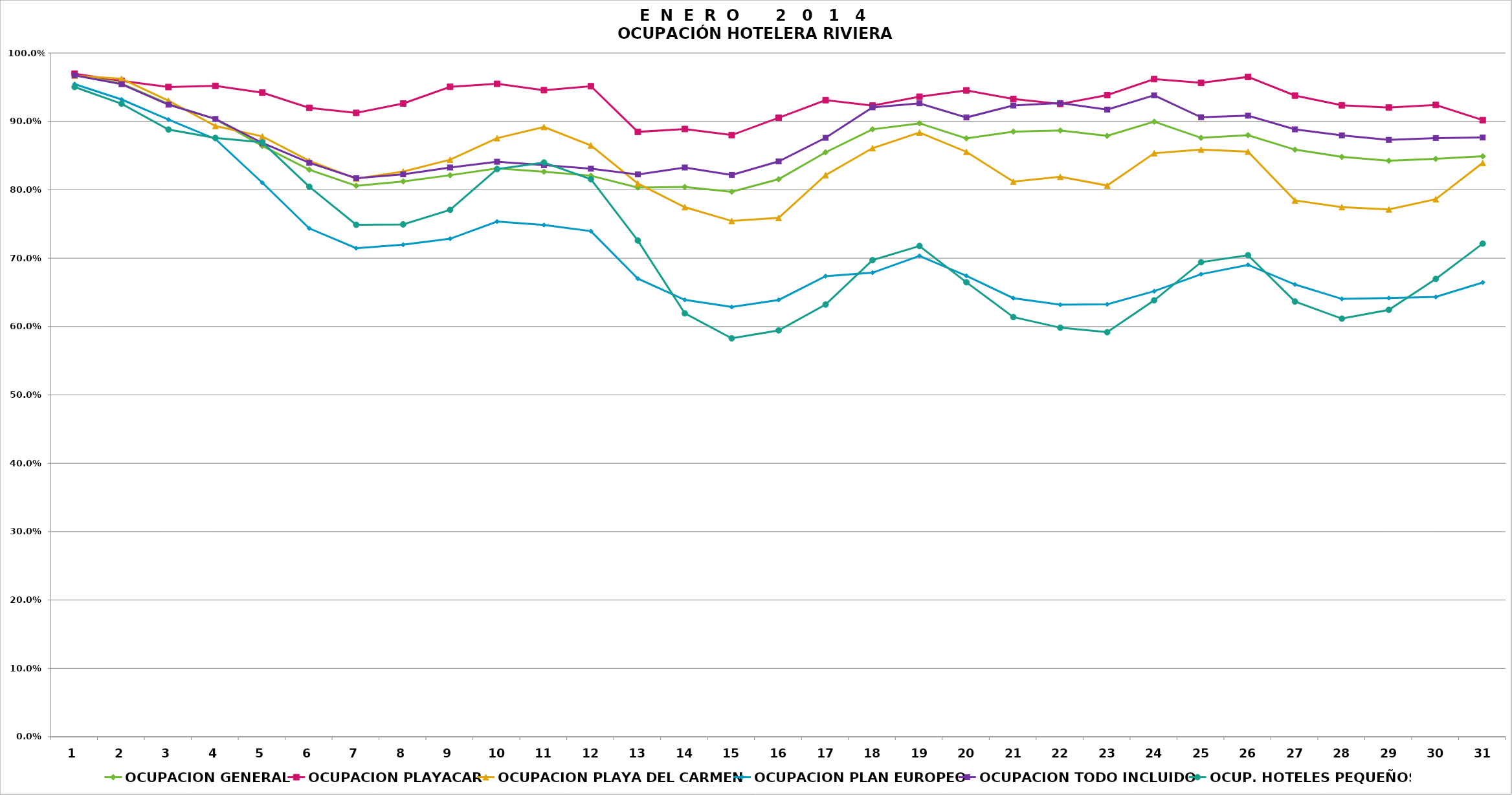
| Category | OCUPACION GENERAL | OCUPACION PLAYACAR | OCUPACION PLAYA DEL CARMEN | OCUPACION PLAN EUROPEO | OCUPACION TODO INCLUIDO | OCUP. HOTELES PEQUEÑOS |
|---|---|---|---|---|---|---|
| 1.0 | 0.97 | 0.97 | 0.967 | 0.955 | 0.967 | 0.95 |
| 2.0 | 0.955 | 0.959 | 0.962 | 0.932 | 0.954 | 0.926 |
| 3.0 | 0.926 | 0.95 | 0.93 | 0.903 | 0.924 | 0.888 |
| 4.0 | 0.903 | 0.952 | 0.893 | 0.874 | 0.904 | 0.876 |
| 5.0 | 0.864 | 0.942 | 0.878 | 0.81 | 0.868 | 0.869 |
| 6.0 | 0.829 | 0.92 | 0.842 | 0.744 | 0.84 | 0.804 |
| 7.0 | 0.806 | 0.912 | 0.816 | 0.715 | 0.817 | 0.749 |
| 8.0 | 0.812 | 0.926 | 0.827 | 0.72 | 0.823 | 0.749 |
| 9.0 | 0.821 | 0.951 | 0.844 | 0.728 | 0.833 | 0.771 |
| 10.0 | 0.831 | 0.955 | 0.876 | 0.754 | 0.841 | 0.83 |
| 11.0 | 0.826 | 0.946 | 0.892 | 0.748 | 0.836 | 0.84 |
| 12.0 | 0.821 | 0.952 | 0.865 | 0.74 | 0.831 | 0.816 |
| 13.0 | 0.803 | 0.885 | 0.809 | 0.67 | 0.822 | 0.726 |
| 14.0 | 0.804 | 0.889 | 0.775 | 0.639 | 0.833 | 0.619 |
| 15.0 | 0.797 | 0.88 | 0.754 | 0.629 | 0.822 | 0.583 |
| 16.0 | 0.816 | 0.905 | 0.759 | 0.639 | 0.842 | 0.594 |
| 17.0 | 0.855 | 0.931 | 0.822 | 0.674 | 0.876 | 0.632 |
| 18.0 | 0.888 | 0.923 | 0.861 | 0.679 | 0.921 | 0.697 |
| 19.0 | 0.897 | 0.936 | 0.884 | 0.703 | 0.926 | 0.718 |
| 20.0 | 0.875 | 0.945 | 0.856 | 0.674 | 0.906 | 0.665 |
| 21.0 | 0.885 | 0.933 | 0.812 | 0.642 | 0.923 | 0.614 |
| 22.0 | 0.887 | 0.926 | 0.819 | 0.632 | 0.927 | 0.598 |
| 23.0 | 0.879 | 0.938 | 0.806 | 0.632 | 0.917 | 0.592 |
| 24.0 | 0.9 | 0.962 | 0.854 | 0.652 | 0.938 | 0.638 |
| 25.0 | 0.876 | 0.956 | 0.859 | 0.677 | 0.906 | 0.694 |
| 26.0 | 0.88 | 0.965 | 0.856 | 0.69 | 0.908 | 0.704 |
| 27.0 | 0.859 | 0.938 | 0.784 | 0.662 | 0.888 | 0.637 |
| 28.0 | 0.848 | 0.924 | 0.775 | 0.64 | 0.88 | 0.612 |
| 29.0 | 0.842 | 0.92 | 0.771 | 0.642 | 0.873 | 0.624 |
| 30.0 | 0.845 | 0.924 | 0.786 | 0.643 | 0.876 | 0.67 |
| 31.0 | 0.849 | 0.902 | 0.839 | 0.664 | 0.876 | 0.721 |